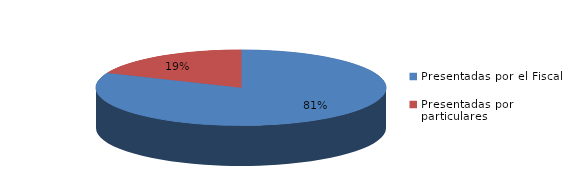
| Category | Series 0 |
|---|---|
| Presentadas por el Fiscal | 333 |
| Presentadas por particulares | 76 |